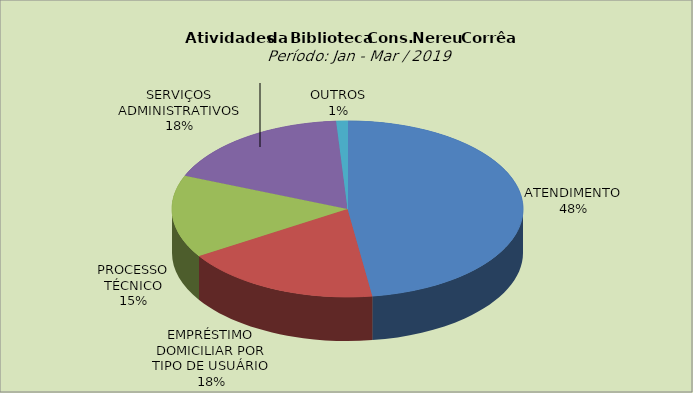
| Category | Series 0 |
|---|---|
| ATENDIMENTO | 47.749 |
| EMPRÉSTIMO DOMICILIAR POR TIPO DE USUÁRIO | 18.283 |
| PROCESSO TÉCNICO | 15.15 |
| SERVIÇOS ADMINISTRATIVOS | 17.782 |
| OUTROS | 1.036 |